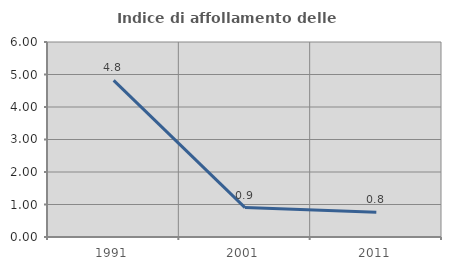
| Category | Indice di affollamento delle abitazioni  |
|---|---|
| 1991.0 | 4.819 |
| 2001.0 | 0.906 |
| 2011.0 | 0.763 |